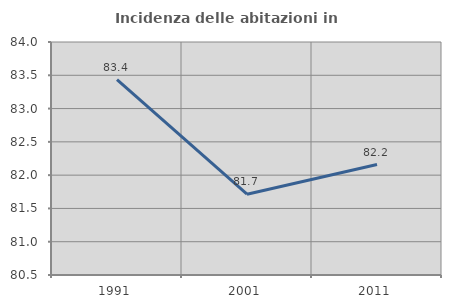
| Category | Incidenza delle abitazioni in proprietà  |
|---|---|
| 1991.0 | 83.436 |
| 2001.0 | 81.714 |
| 2011.0 | 82.159 |